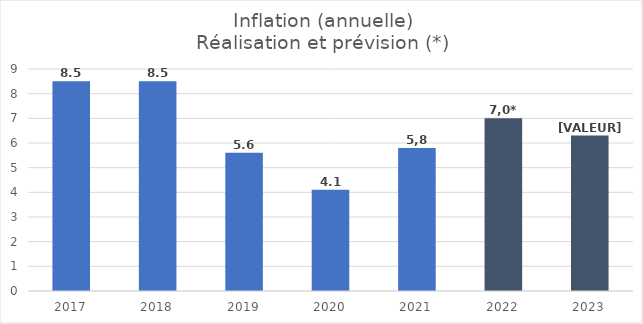
| Category |  Inflation  |
|---|---|
| 2017.0 | 8.5 |
| 2018.0 | 8.5 |
| 2019.0 | 5.6 |
| 2020.0 | 4.1 |
| 2021.0 | 5.8 |
| 2022.0 | 7 |
| 2023.0 | 6.3 |